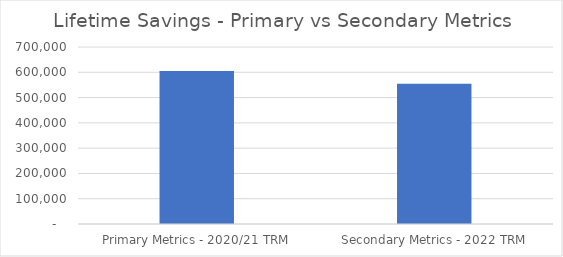
| Category | Series 0 |
|---|---|
|  Primary Metrics - 2020/21 TRM  | 604772.134 |
|  Secondary Metrics - 2022 TRM  | 554328.3 |